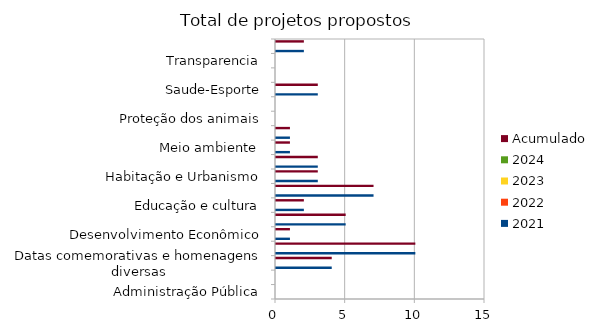
| Category | 2021 | 2022 | 2023 | 2024 | Acumulado |
|---|---|---|---|---|---|
| Administração Pública | 0 |  |  |  | 0 |
| Combate à corrupção  | 0 |  |  |  | 0 |
| Datas comemorativas e homenagens diversas | 4 |  |  |  | 4 |
| Denominação de logradouro | 10 |  |  |  | 10 |
| Desenvolvimento Econômico | 1 |  |  |  | 1 |
| Desenvolvimento Social  | 5 |  |  |  | 5 |
| Educação e cultura | 2 |  |  |  | 2 |
| Frente parlamentar | 7 |  |  |  | 7 |
| Habitação e Urbanismo | 3 |  |  |  | 3 |
| Lei Orgânica do Município | 3 |  |  |  | 3 |
| Meio ambiente  | 1 |  |  |  | 1 |
| Mobilidade | 1 |  |  |  | 1 |
| Proteção dos animais | 0 |  |  |  | 0 |
| Regimento Interno da CMSP | 0 |  |  |  | 0 |
| Saude-Esporte | 3 |  |  |  | 3 |
| Segurança Pública | 0 |  |  |  | 0 |
| Transparencia | 0 |  |  |  | 0 |
| Tributação | 2 |  |  |  | 2 |